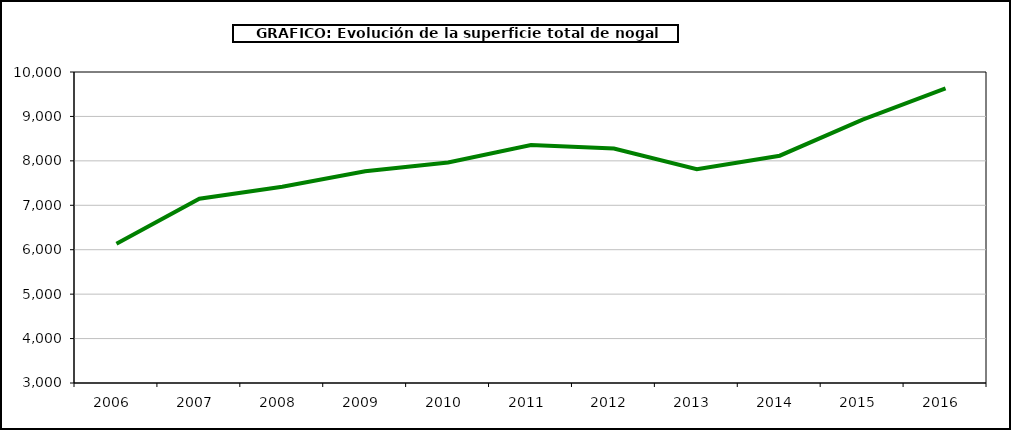
| Category | superficie nogal |
|---|---|
| 2006.0 | 6134 |
| 2007.0 | 7147 |
| 2008.0 | 7418 |
| 2009.0 | 7765 |
| 2010.0 | 7962 |
| 2011.0 | 8355 |
| 2012.0 | 8278 |
| 2013.0 | 7811 |
| 2014.0 | 8116 |
| 2015.0 | 8926 |
| 2016.0 | 9634 |